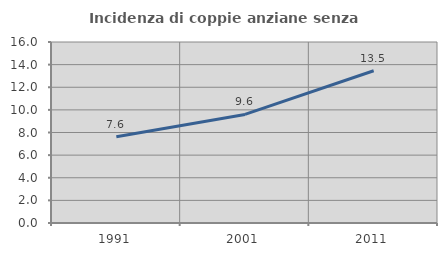
| Category | Incidenza di coppie anziane senza figli  |
|---|---|
| 1991.0 | 7.621 |
| 2001.0 | 9.6 |
| 2011.0 | 13.46 |